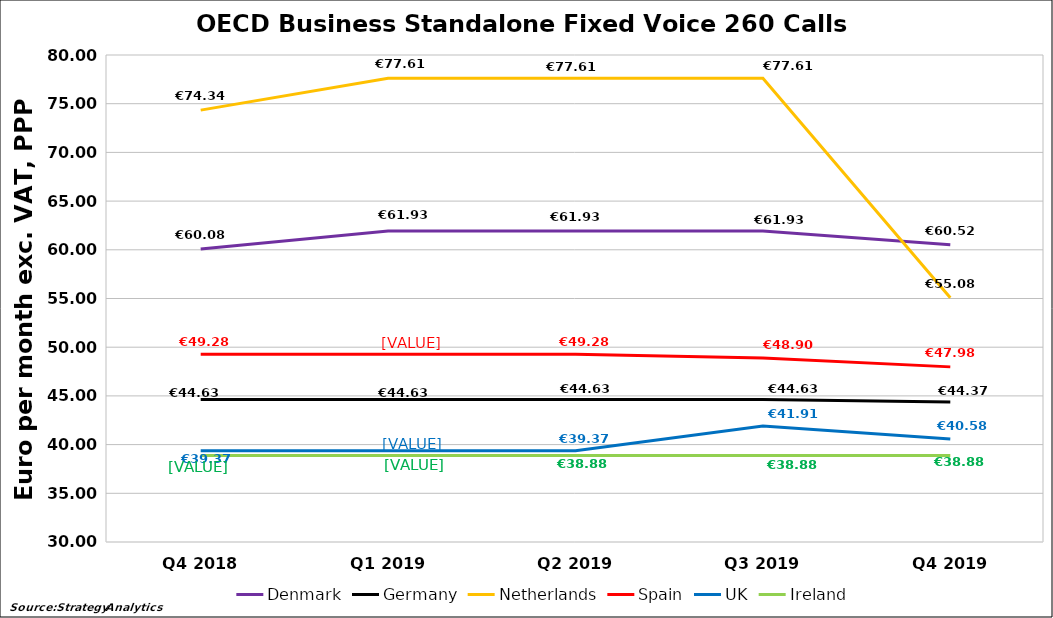
| Category | Denmark | Germany | Netherlands | Spain | UK | Ireland |
|---|---|---|---|---|---|---|
| Q4 2018 | 60.08 | 44.626 | 74.339 | 49.275 | 39.367 | 38.881 |
| Q1 2019 | 61.933 | 44.626 | 77.612 | 49.275 | 39.367 | 38.881 |
| Q2 2019 | 61.933 | 44.626 | 77.612 | 49.275 | 39.367 | 38.881 |
| Q3 2019 | 61.933 | 44.626 | 77.612 | 48.898 | 41.908 | 38.881 |
| Q4 2019 | 60.52 | 44.37 | 55.08 | 47.98 | 40.58 | 38.88 |